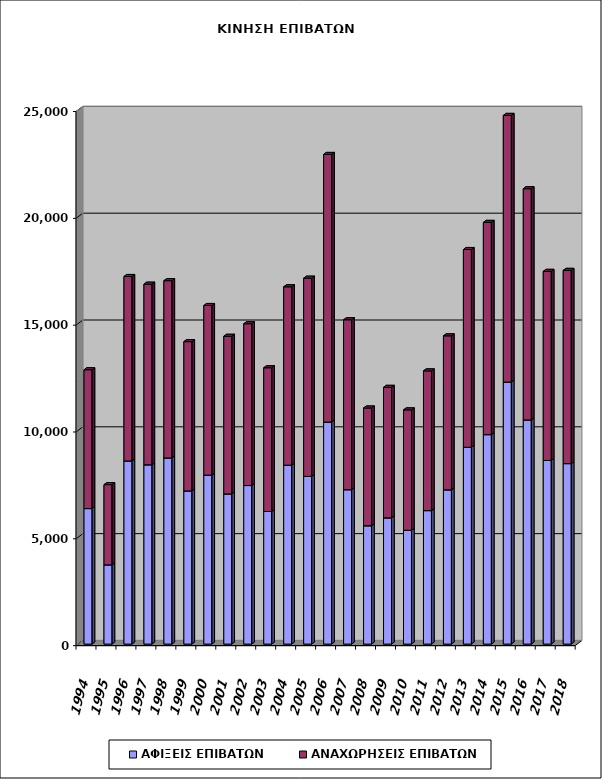
| Category | ΑΦΙΞΕΙΣ ΕΠΙΒΑΤΩΝ | ΑΝΑΧΩΡΗΣΕΙΣ ΕΠΙΒΑΤΩΝ |
|---|---|---|
| 1994.0 | 6343 | 6497 |
| 1995.0 | 3708 | 3755 |
| 1996.0 | 8574 | 8631 |
| 1997.0 | 8391 | 8454 |
| 1998.0 | 8711 | 8299 |
| 1999.0 | 7169 | 6987 |
| 2000.0 | 7908 | 7940 |
| 2001.0 | 7029 | 7377 |
| 2002.0 | 7421 | 7572 |
| 2003.0 | 6206 | 6727 |
| 2004.0 | 8374 | 8348 |
| 2005.0 | 7850 | 9276 |
| 2006.0 | 10392 | 12526 |
| 2007.0 | 7227 | 7952 |
| 2008.0 | 5539 | 5511 |
| 2009.0 | 5908 | 6108 |
| 2010.0 | 5328 | 5633 |
| 2011.0 | 6248 | 6538 |
| 2012.0 | 7220 | 7207 |
| 2013.0 | 9213 | 9255 |
| 2014.0 | 9804 | 9934 |
| 2015.0 | 12266 | 12479 |
| 2016.0 | 10492 | 10822 |
| 2017.0 | 8596 | 8850 |
| 2018.0 | 8448 | 9044 |